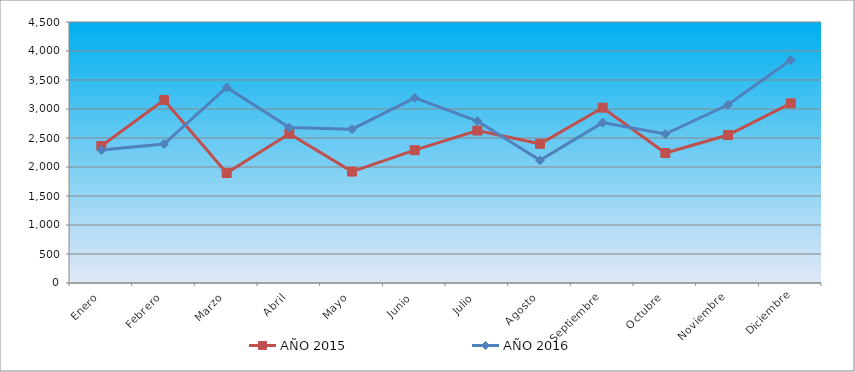
| Category | AÑO 2015 | AÑO 2016 |
|---|---|---|
| Enero | 2362 | 2292 |
| Febrero | 3156 | 2395 |
| Marzo | 1897 | 3372 |
| Abril | 2573 | 2679 |
| Mayo | 1921 | 2652 |
| Junio | 2290 | 3193 |
| Julio | 2628 | 2792 |
| Agosto | 2400 | 2115 |
| Septiembre | 3023 | 2765 |
| Octubre | 2241 | 2568 |
| Noviembre | 2551 | 3073 |
| Diciembre | 3098 | 3845 |